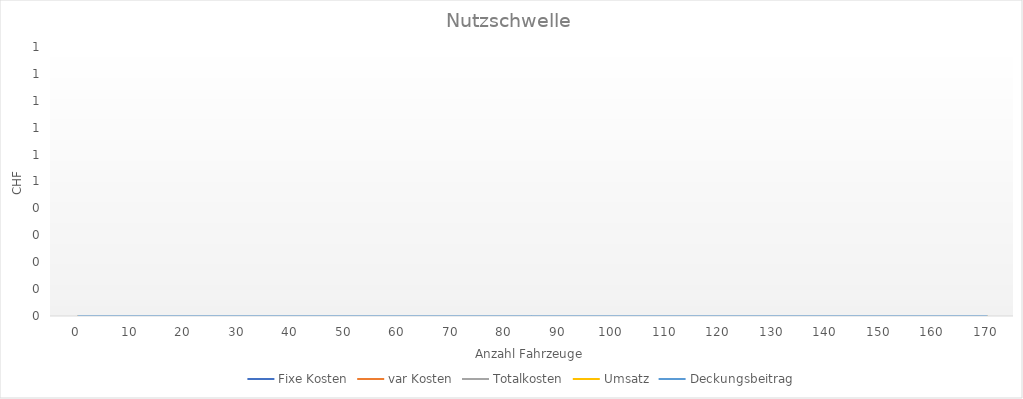
| Category | Fixe Kosten | var Kosten | Totalkosten | Umsatz | Deckungsbeitrag |
|---|---|---|---|---|---|
| 0.0 | 0 | 0 | 0 | 0 | 0 |
| 10.0 | 0 | 0 | 0 | 0 | 0 |
| 20.0 | 0 | 0 | 0 | 0 | 0 |
| 30.0 | 0 | 0 | 0 | 0 | 0 |
| 40.0 | 0 | 0 | 0 | 0 | 0 |
| 50.0 | 0 | 0 | 0 | 0 | 0 |
| 60.0 | 0 | 0 | 0 | 0 | 0 |
| 70.0 | 0 | 0 | 0 | 0 | 0 |
| 80.0 | 0 | 0 | 0 | 0 | 0 |
| 90.0 | 0 | 0 | 0 | 0 | 0 |
| 100.0 | 0 | 0 | 0 | 0 | 0 |
| 110.0 | 0 | 0 | 0 | 0 | 0 |
| 120.0 | 0 | 0 | 0 | 0 | 0 |
| 130.0 | 0 | 0 | 0 | 0 | 0 |
| 140.0 | 0 | 0 | 0 | 0 | 0 |
| 150.0 | 0 | 0 | 0 | 0 | 0 |
| 160.0 | 0 | 0 | 0 | 0 | 0 |
| 170.0 | 0 | 0 | 0 | 0 | 0 |